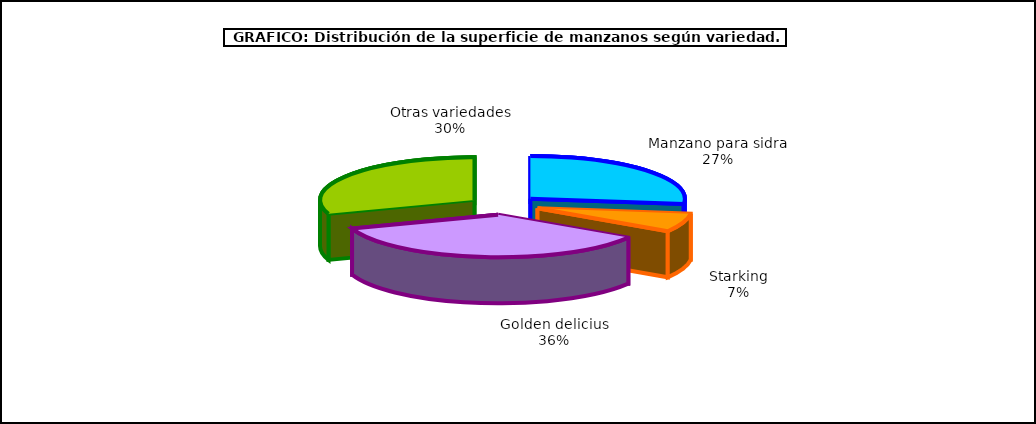
| Category | superficie |
|---|---|
| 0 | 8.245 |
| 1 | 2.152 |
| 2 | 10.895 |
| 3 | 9.258 |